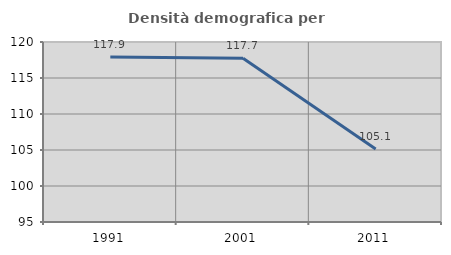
| Category | Densità demografica |
|---|---|
| 1991.0 | 117.927 |
| 2001.0 | 117.743 |
| 2011.0 | 105.129 |